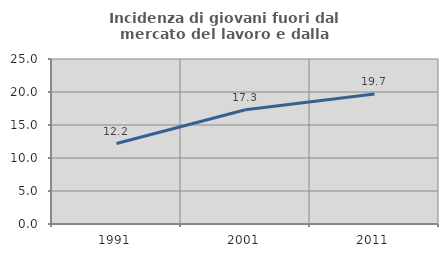
| Category | Incidenza di giovani fuori dal mercato del lavoro e dalla formazione  |
|---|---|
| 1991.0 | 12.186 |
| 2001.0 | 17.318 |
| 2011.0 | 19.681 |